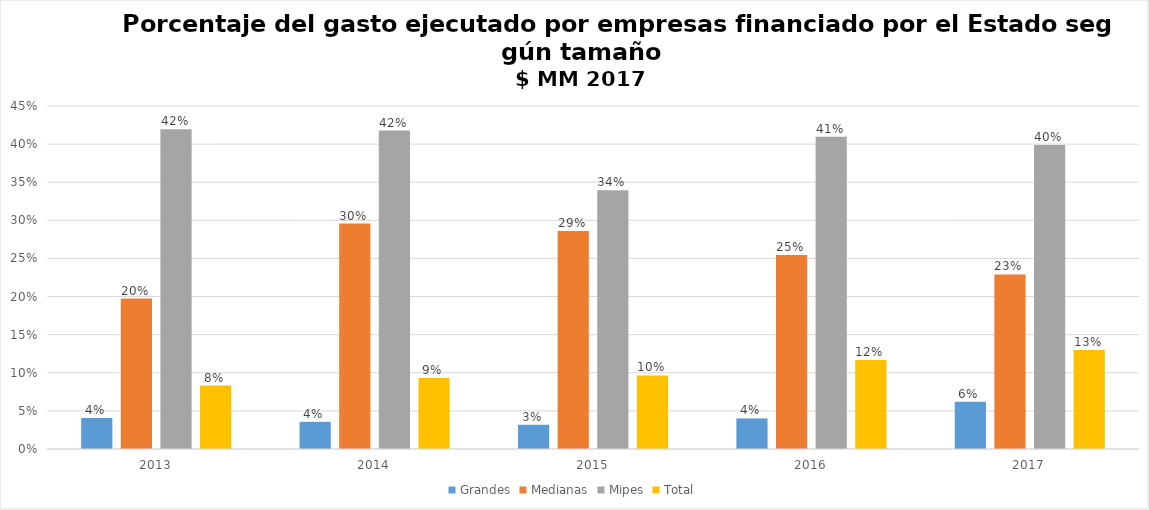
| Category | Grandes | Medianas | Mipes | Total |
|---|---|---|---|---|
| 2013.0 | 0.041 | 0.197 | 0.42 | 0.083 |
| 2014.0 | 0.036 | 0.296 | 0.418 | 0.093 |
| 2015.0 | 0.032 | 0.286 | 0.34 | 0.097 |
| 2016.0 | 0.04 | 0.254 | 0.41 | 0.117 |
| 2017.0 | 0.062 | 0.229 | 0.399 | 0.13 |